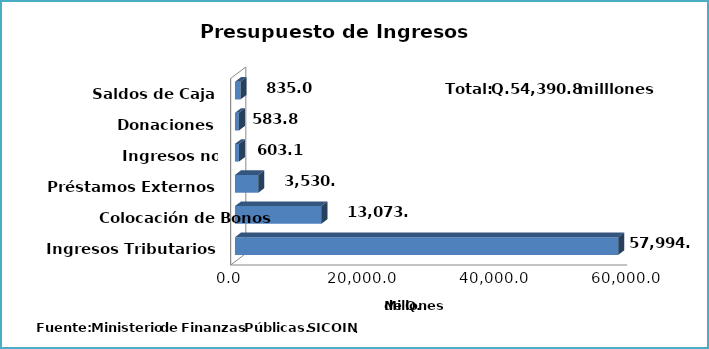
| Category | Series 0 |
|---|---|
| Ingresos Tributarios | 57994.8 |
| Colocación de Bonos | 13073.4 |
| Préstamos Externos | 3530.7 |
| Ingresos no Tributarios | 603.1 |
| Donaciones | 583.8 |
| Saldos de Caja | 835 |